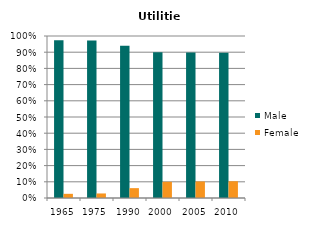
| Category | Male | Female |
|---|---|---|
| 1965.0 | 0.974 | 0.026 |
| 1975.0 | 0.972 | 0.028 |
| 1990.0 | 0.939 | 0.061 |
| 2000.0 | 0.9 | 0.1 |
| 2005.0 | 0.898 | 0.102 |
| 2010.0 | 0.897 | 0.103 |